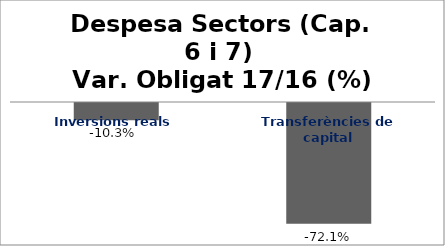
| Category | Series 0 |
|---|---|
| Inversions reals | -0.103 |
| Transferències de capital | -0.721 |